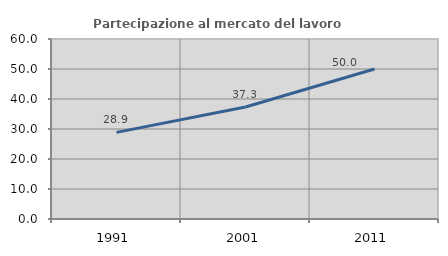
| Category | Partecipazione al mercato del lavoro  femminile |
|---|---|
| 1991.0 | 28.877 |
| 2001.0 | 37.327 |
| 2011.0 | 50 |